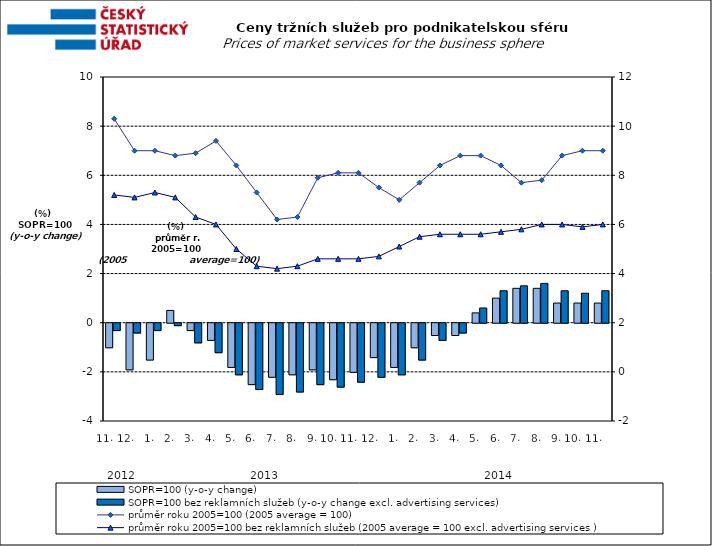
| Category | SOPR=100 (y-o-y change)   | SOPR=100 bez reklamních služeb (y-o-y change excl. advertising services)   |
|---|---|---|
| 0 | -1 | -0.3 |
| 1 | -1.9 | -0.4 |
| 2 | -1.5 | -0.3 |
| 3 | 0.5 | -0.1 |
| 4 | -0.3 | -0.8 |
| 5 | -0.7 | -1.2 |
| 6 | -1.8 | -2.1 |
| 7 | -2.5 | -2.7 |
| 8 | -2.2 | -2.9 |
| 9 | -2.1 | -2.8 |
| 10 | -1.9 | -2.5 |
| 11 | -2.3 | -2.6 |
| 12 | -2 | -2.4 |
| 13 | -1.4 | -2.2 |
| 14 | -1.8 | -2.1 |
| 15 | -1 | -1.5 |
| 16 | -0.5 | -0.7 |
| 17 | -0.5 | -0.4 |
| 18 | 0.4 | 0.6 |
| 19 | 1 | 1.3 |
| 20 | 1.4 | 1.5 |
| 21 | 1.4 | 1.6 |
| 22 | 0.8 | 1.3 |
| 23 | 0.8 | 1.2 |
| 24 | 0.8 | 1.3 |